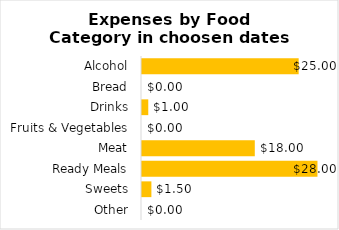
| Category | Expenses |
|---|---|
| Alcohol | 25 |
| Bread | 0 |
| Drinks | 1 |
| Fruits & Vegetables | 0 |
| Meat | 18 |
| Ready Meals | 28 |
| Sweets | 1.5 |
| Other | 0 |